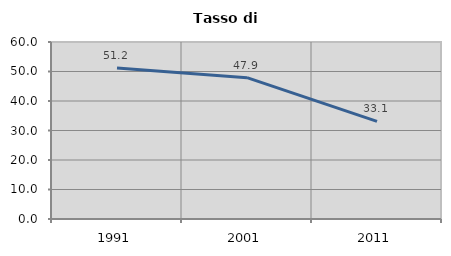
| Category | Tasso di disoccupazione   |
|---|---|
| 1991.0 | 51.179 |
| 2001.0 | 47.91 |
| 2011.0 | 33.073 |